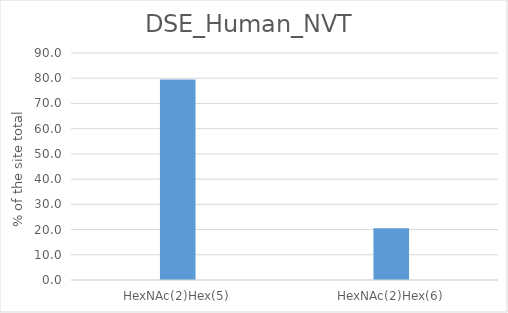
| Category | Series 0 |
|---|---|
| HexNAc(2)Hex(5) | 79.494 |
| HexNAc(2)Hex(6) | 20.506 |